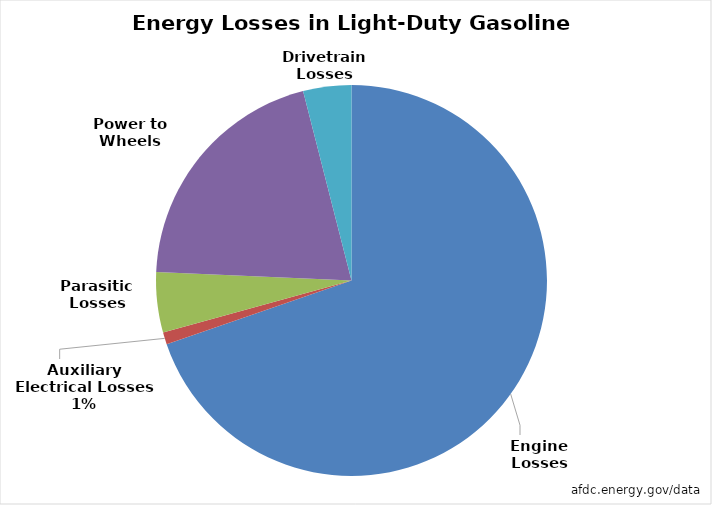
| Category | Series 0 |
|---|---|
| Engine Losses | 0.7 |
| Auxiliary Electrical Losses | 0.01 |
| Parasitic Losses | 0.05 |
| Power to Wheels | 0.204 |
| Drivetrain Losses | 0.04 |